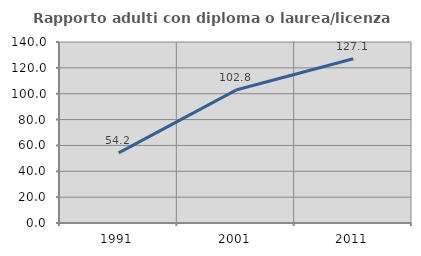
| Category | Rapporto adulti con diploma o laurea/licenza media  |
|---|---|
| 1991.0 | 54.21 |
| 2001.0 | 102.822 |
| 2011.0 | 127.069 |